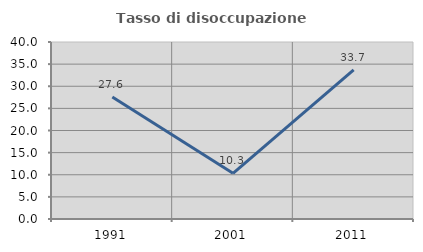
| Category | Tasso di disoccupazione giovanile  |
|---|---|
| 1991.0 | 27.564 |
| 2001.0 | 10.317 |
| 2011.0 | 33.696 |